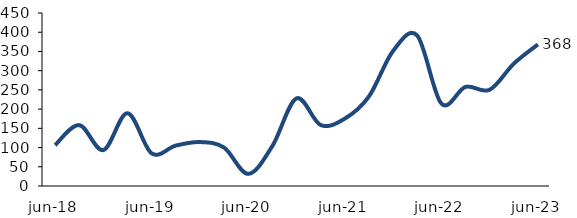
| Category | Series 0 |
|---|---|
| 2018-06-01 | 106.28 |
| 2018-09-01 | 158.344 |
| 2018-12-01 | 93.451 |
| 2019-03-01 | 189.323 |
| 2019-06-01 | 84.899 |
| 2019-09-01 | 105.151 |
| 2019-12-01 | 114.316 |
| 2020-03-01 | 99.928 |
| 2020-06-01 | 31.503 |
| 2020-09-01 | 103.901 |
| 2020-12-01 | 227.889 |
| 2021-03-01 | 158.592 |
| 2021-06-01 | 175.211 |
| 2021-09-01 | 232.848 |
| 2021-12-01 | 351.253 |
| 2022-03-01 | 391.28 |
| 2022-06-01 | 214.509 |
| 2022-09-01 | 257.775 |
| 2022-12-01 | 250.285 |
| 2023-03-01 | 318.236 |
| 2023-06-01 | 368.248 |